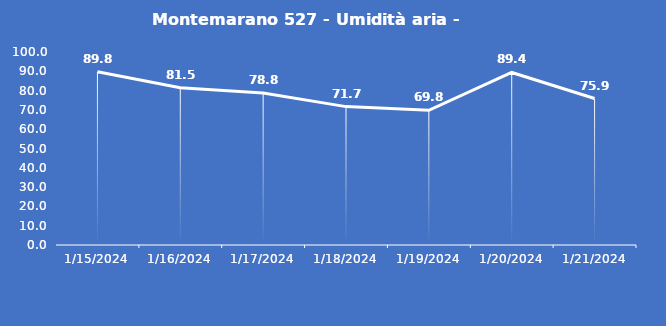
| Category | Montemarano 527 - Umidità aria - Grezzo (%) |
|---|---|
| 1/15/24 | 89.8 |
| 1/16/24 | 81.5 |
| 1/17/24 | 78.8 |
| 1/18/24 | 71.7 |
| 1/19/24 | 69.8 |
| 1/20/24 | 89.4 |
| 1/21/24 | 75.9 |